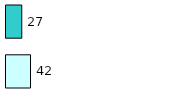
| Category | Series 0 | Series 1 |
|---|---|---|
| 0 | 42 | 27 |